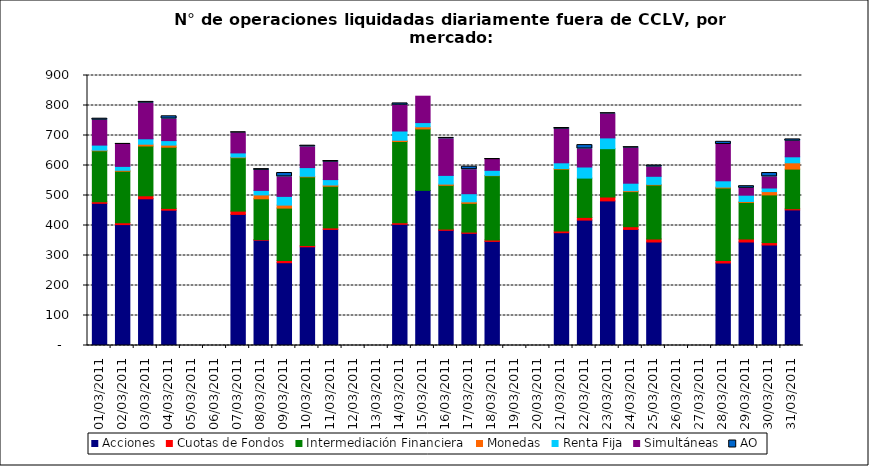
| Category | Acciones | Cuotas de Fondos | Intermediación Financiera | Monedas | Renta Fija | Simultáneas | AO |
|---|---|---|---|---|---|---|---|
| 01/03/2011 | 474 | 5 | 170 | 2 | 17 | 83 | 5 |
| 02/03/2011 | 403 | 6 | 172 | 3 | 13 | 73 | 2 |
| 03/03/2011 | 489 | 10 | 166 | 6 | 18 | 119 | 4 |
| 04/03/2011 | 451 | 6 | 204 | 7 | 15 | 72 | 9 |
| 07/03/2011 | 437 | 11 | 178 | 2 | 14 | 67 | 1 |
| 08/03/2011 | 351 | 2 | 136 | 13 | 15 | 67 | 4 |
| 09/03/2011 | 276 | 7 | 175 | 10 | 29 | 65 | 13 |
| 10/03/2011 | 329 | 4 | 229 | 2 | 29 | 69 | 4 |
| 11/03/2011 | 387 | 5 | 139 | 4 | 18 | 58 | 4 |
| 14/03/2011 | 404 | 5 | 271 | 4 | 31 | 86 | 6 |
| 15/03/2011 | 517 | 0 | 205 | 7 | 14 | 88 | 0 |
| 16/03/2011 | 384 | 4 | 146 | 4 | 29 | 122 | 3 |
| 17/03/2011 | 374 | 4 | 96 | 5 | 27 | 80 | 10 |
| 18/03/2011 | 347 | 5 | 214 | 1 | 17 | 36 | 1 |
| 21/03/2011 | 376 | 6 | 206 | 2 | 19 | 112 | 4 |
| 22/03/2011 | 418 | 9 | 131 | 0 | 37 | 60 | 13 |
| 23/03/2011 | 482 | 13 | 161 | 0 | 36 | 80 | 2 |
| 24/03/2011 | 387 | 9 | 117 | 3 | 25 | 117 | 3 |
| 25/03/2011 | 345 | 10 | 180 | 2 | 27 | 31 | 5 |
| 28/03/2011 | 275 | 8 | 242 | 3 | 21 | 121 | 9 |
| 29/03/2011 | 345 | 10 | 122 | 3 | 21 | 23 | 7 |
| 30/03/2011 | 335 | 8 | 159 | 11 | 12 | 37 | 13 |
| 31/03/2011 | 452 | 4 | 132 | 21 | 20 | 52 | 6 |